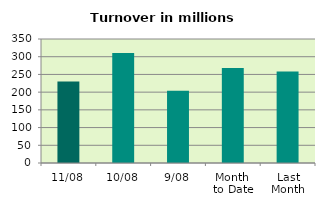
| Category | Series 0 |
|---|---|
| 11/08 | 230.196 |
| 10/08 | 310.505 |
| 9/08 | 204.04 |
| Month 
to Date | 268.252 |
| Last
Month | 258.125 |